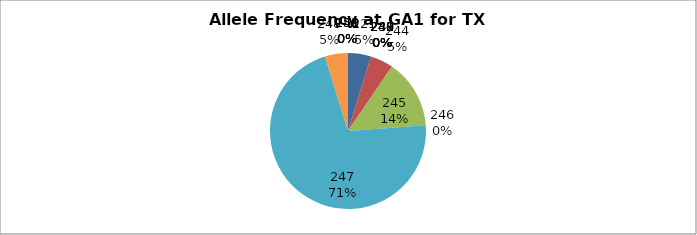
| Category | Series 0 |
|---|---|
| 221.0 | 0.048 |
| 238.0 | 0 |
| 239.0 | 0 |
| 240.0 | 0 |
| 241.0 | 0 |
| 242.0 | 0 |
| 243.0 | 0 |
| 244.0 | 0.048 |
| 245.0 | 0.143 |
| 246.0 | 0 |
| 247.0 | 0.714 |
| 248.0 | 0.048 |
| 249.0 | 0 |
| 250.0 | 0 |
| 251.0 | 0 |
| 253.0 | 0 |